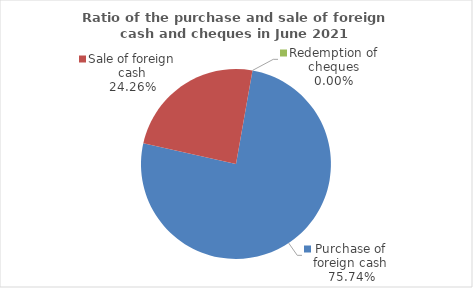
| Category | Series 0 |
|---|---|
| Purchase of foreign cash | 75.743 |
| Sale of foreign cash | 24.257 |
| Redemption of cheques | 0 |